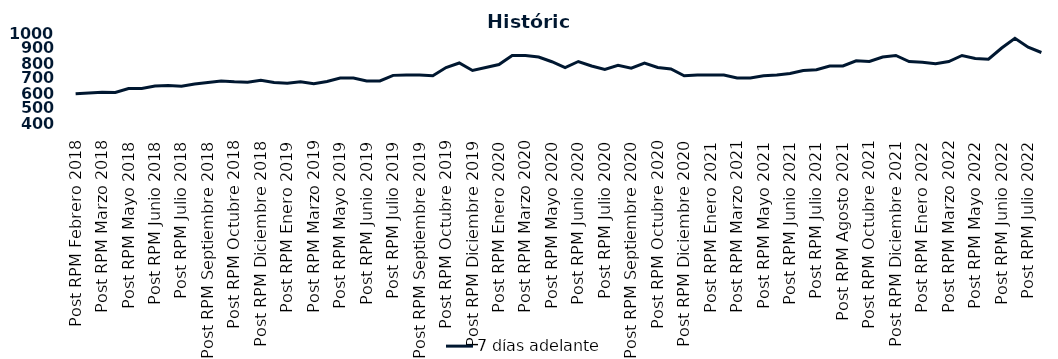
| Category | 7 días adelante  |
|---|---|
| Post RPM Febrero 2018 | 595 |
| Pre RPM Marzo 2018 | 600 |
| Post RPM Marzo 2018 | 605 |
| Pre RPM Mayo 2018 | 603 |
| Post RPM Mayo 2018 | 630 |
| Pre RPM Junio 2018 | 630 |
| Post RPM Junio 2018 | 646.5 |
| Pre RPM Julio 2018 | 650 |
| Post RPM Julio 2018 | 645 |
| Pre RPM Septiembre 2018 | 660 |
| Post RPM Septiembre 2018 | 670 |
| Pre RPM Octubre 2018 | 680 |
| Post RPM Octubre 2018 | 675 |
| Pre RPM Diciembre 2018 | 672.5 |
| Post RPM Diciembre 2018 | 685 |
| Pre RPM Enero 2019 | 670 |
| Post RPM Enero 2019 | 665 |
| Pre RPM Marzo 2019 | 675 |
| Post RPM Marzo 2019 | 661 |
| Pre RPM Mayo 2019 | 677 |
| Post RPM Mayo 2019 | 700 |
| Pre RPM Junio 2019 | 700.5 |
| Post RPM Junio 2019 | 680 |
| Pre RPM Julio 2019 | 680 |
| Post RPM Julio 2019 | 717.5 |
| Pre RPM Septiembre 2019 | 720 |
| Post RPM Septiembre 2019 | 720 |
| Pre RPM Octubre 2019 | 715 |
| Post RPM Octubre 2019 | 770 |
| Pre RPM Diciembre 2019 | 800 |
| Post RPM Diciembre 2019 | 750 |
| Pre RPM Enero 2020 | 770 |
| Post RPM Enero 2020 | 790 |
| Pre RPM Marzo 2020 | 850 |
| Post RPM Marzo 2020 | 850 |
| Pre RPM Mayo 2020 | 840 |
| Post RPM Mayo 2020 | 808.5 |
| Pre RPM Junio 2020 | 770 |
| Post RPM Junio 2020 | 810 |
| Pre RPM Julio 2020 | 780 |
| Post RPM Julio 2020 | 757 |
| Pre RPM Septiembre 2020 | 785 |
| Post RPM Septiembre 2020 | 765 |
| Pre RPM Octubre 2020 | 800 |
| Post RPM Octubre 2020 | 770 |
| Pre RPM Diciembre 2020 | 760 |
| Post RPM Diciembre 2020 | 715 |
| Pre RPM Enero 2021 | 720 |
| Post RPM Enero 2021 | 720 |
| Pre RPM Marzo 2021 | 720 |
| Post RPM Marzo 2021 | 700 |
| Pre RPM Mayo 2021 | 700 |
| Post RPM Mayo 2021 | 715 |
| Pre RPM Junio 2021 | 720 |
| Post RPM Junio 2021 | 730 |
| Pre RPM Julio 2021 | 750 |
| Post RPM Julio 2021 | 755 |
| Pre RPM Agosto 2021 | 780 |
| Post RPM Agosto 2021 | 780 |
| Pre RPM Octubre 2021 | 815 |
| Post RPM Octubre 2021 | 810 |
| Pre RPM Diciembre 2021 | 840 |
| Post RPM Diciembre 2021 | 850 |
| Pre RPM Enero 2022 | 810 |
| Post RPM Enero 2022 | 805 |
| Pre RPM Marzo 2022 | 795 |
| Post RPM Marzo 2022 | 810 |
| Pre RPM Mayo 2022 | 850 |
| Post RPM Mayo 2022 | 830 |
| Pre RPM Junio 2022 | 825 |
| Post RPM Junio 2022 | 900 |
| Pre RPM Julio 2022 | 965 |
| Post RPM Julio 2022 | 905 |
| Pre RPM Septiembre 2022 | 870 |